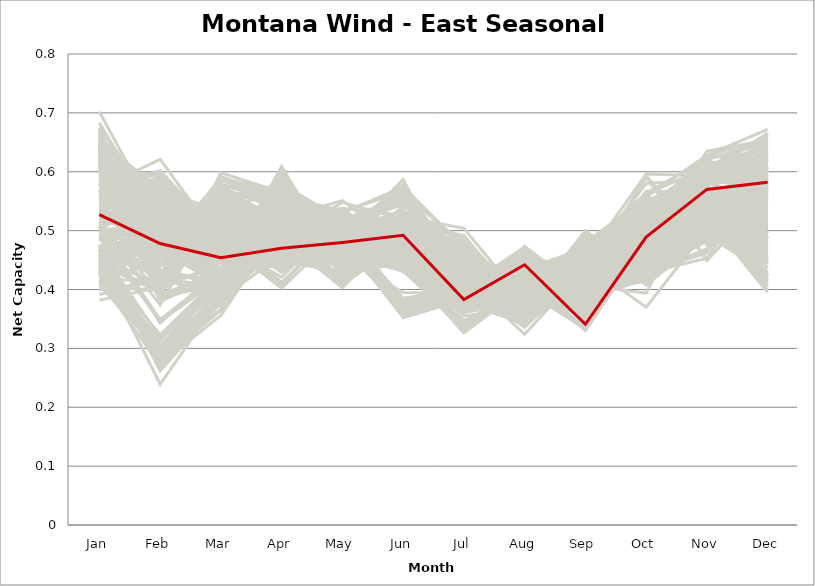
| Category | sample_001 | sample_002 | sample_003 | sample_004 | sample_005 | sample_006 | sample_007 | sample_008 | sample_009 | sample_010 | sample_011 | sample_012 | sample_013 | sample_014 | sample_015 | sample_016 | sample_017 | sample_018 | sample_019 | sample_020 | sample_021 | sample_022 | sample_023 | sample_024 | sample_025 | sample_026 | sample_027 | sample_028 | sample_029 | sample_030 | sample_031 | sample_032 | sample_033 | sample_034 | sample_035 | sample_036 | sample_037 | sample_038 | sample_039 | sample_040 | sample_041 | sample_042 | sample_043 | sample_044 | sample_045 | sample_046 | sample_047 | sample_048 | sample_049 | sample_050 | sample_051 | sample_052 | sample_053 | sample_054 | sample_055 | sample_056 | sample_057 | sample_058 | sample_059 | sample_060 | sample_061 | sample_062 | sample_063 | sample_064 | sample_065 | sample_066 | sample_067 | sample_068 | sample_069 | sample_070 | sample_071 | sample_072 | sample_073 | sample_074 | sample_075 | sample_076 | sample_077 | sample_078 | sample_079 | sample_080 | sample_081 | sample_082 | sample_083 | sample_084 | sample_085 | sample_086 | sample_087 | sample_088 | sample_089 | sample_090 | sample_091 | sample_092 | sample_093 | sample_094 | sample_095 | sample_096 | sample_097 | sample_098 | sample_099 | sample_100 | sample_101 | sample_102 | sample_103 | sample_104 | sample_105 | sample_106 | sample_107 | sample_108 | sample_109 | sample_110 | sample_111 | sample_112 | sample_113 | sample_114 | sample_115 | sample_116 | sample_117 | sample_118 | sample_119 | sample_120 | sample_121 | sample_122 | sample_123 | sample_124 | sample_125 | sample_126 | sample_127 | sample_128 | sample_129 | sample_130 | sample_131 | sample_132 | sample_133 | sample_134 | sample_135 | sample_136 | sample_137 | sample_138 | sample_139 | sample_140 | sample_141 | sample_142 | sample_143 | sample_144 | sample_145 | sample_146 | sample_147 | sample_148 | sample_149 | sample_150 | sample_151 | sample_152 | sample_153 | sample_154 | sample_155 | sample_156 | sample_157 | sample_158 | sample_159 | sample_160 | sample_161 | sample_162 | sample_163 | sample_164 | sample_165 | sample_166 | sample_167 | sample_168 | sample_169 | sample_170 | sample_171 | sample_172 | sample_173 | sample_174 | sample_175 | sample_176 | sample_177 | sample_178 | sample_179 | sample_180 | sample_181 | sample_182 | sample_183 | sample_184 | sample_185 | sample_186 | sample_187 | sample_188 | sample_189 | sample_190 | sample_191 | sample_192 | sample_193 | sample_194 | sample_195 | sample_196 | sample_197 | sample_198 | sample_199 | sample_200 | sample_201 | sample_202 | sample_203 | sample_204 | sample_205 | sample_206 | sample_207 | sample_208 | sample_209 | sample_210 | sample_211 | sample_212 | sample_213 | sample_214 | sample_215 | sample_216 | sample_217 | sample_218 | sample_219 | sample_220 | sample_221 | sample_222 | sample_223 | sample_224 | sample_225 | sample_227 | sample_228 | sample_229 | sample_230 | sample_231 | sample_232 | sample_233 | sample_234 | sample_235 | sample_236 | sample_237 | sample_238 | sample_239 | sample_240 | sample_241 | sample_242 | sample_243 | sample_244 | sample_245 | sample_246 | sample_247 | sample_248 | sample_249 | sample_250 | sample_226 |
|---|---|---|---|---|---|---|---|---|---|---|---|---|---|---|---|---|---|---|---|---|---|---|---|---|---|---|---|---|---|---|---|---|---|---|---|---|---|---|---|---|---|---|---|---|---|---|---|---|---|---|---|---|---|---|---|---|---|---|---|---|---|---|---|---|---|---|---|---|---|---|---|---|---|---|---|---|---|---|---|---|---|---|---|---|---|---|---|---|---|---|---|---|---|---|---|---|---|---|---|---|---|---|---|---|---|---|---|---|---|---|---|---|---|---|---|---|---|---|---|---|---|---|---|---|---|---|---|---|---|---|---|---|---|---|---|---|---|---|---|---|---|---|---|---|---|---|---|---|---|---|---|---|---|---|---|---|---|---|---|---|---|---|---|---|---|---|---|---|---|---|---|---|---|---|---|---|---|---|---|---|---|---|---|---|---|---|---|---|---|---|---|---|---|---|---|---|---|---|---|---|---|---|---|---|---|---|---|---|---|---|---|---|---|---|---|---|---|---|---|---|---|---|---|---|---|---|---|---|---|---|---|---|---|---|---|---|---|---|---|---|---|---|---|---|---|---|---|---|---|---|
| Jan | 0.559 | 0.462 | 0.667 | 0.669 | 0.508 | 0.556 | 0.417 | 0.619 | 0.51 | 0.529 | 0.648 | 0.466 | 0.66 | 0.649 | 0.641 | 0.44 | 0.51 | 0.636 | 0.592 | 0.585 | 0.433 | 0.468 | 0.413 | 0.558 | 0.567 | 0.454 | 0.612 | 0.562 | 0.423 | 0.65 | 0.464 | 0.647 | 0.464 | 0.62 | 0.449 | 0.47 | 0.432 | 0.428 | 0.425 | 0.584 | 0.587 | 0.537 | 0.672 | 0.508 | 0.702 | 0.457 | 0.624 | 0.599 | 0.489 | 0.431 | 0.475 | 0.466 | 0.595 | 0.513 | 0.45 | 0.609 | 0.625 | 0.634 | 0.586 | 0.654 | 0.5 | 0.399 | 0.476 | 0.64 | 0.537 | 0.637 | 0.519 | 0.486 | 0.404 | 0.532 | 0.625 | 0.549 | 0.595 | 0.473 | 0.462 | 0.675 | 0.503 | 0.561 | 0.535 | 0.466 | 0.613 | 0.532 | 0.638 | 0.635 | 0.578 | 0.553 | 0.494 | 0.663 | 0.642 | 0.62 | 0.572 | 0.459 | 0.449 | 0.443 | 0.542 | 0.655 | 0.607 | 0.488 | 0.488 | 0.434 | 0.522 | 0.607 | 0.628 | 0.616 | 0.589 | 0.603 | 0.45 | 0.473 | 0.46 | 0.598 | 0.525 | 0.634 | 0.569 | 0.621 | 0.629 | 0.455 | 0.656 | 0.573 | 0.669 | 0.641 | 0.65 | 0.439 | 0.476 | 0.465 | 0.469 | 0.408 | 0.534 | 0.447 | 0.629 | 0.639 | 0.613 | 0.502 | 0.63 | 0.569 | 0.582 | 0.617 | 0.46 | 0.631 | 0.464 | 0.627 | 0.436 | 0.421 | 0.583 | 0.643 | 0.668 | 0.639 | 0.568 | 0.644 | 0.657 | 0.452 | 0.441 | 0.429 | 0.663 | 0.447 | 0.613 | 0.614 | 0.563 | 0.543 | 0.576 | 0.559 | 0.391 | 0.58 | 0.669 | 0.487 | 0.602 | 0.43 | 0.605 | 0.431 | 0.432 | 0.631 | 0.472 | 0.454 | 0.453 | 0.658 | 0.47 | 0.47 | 0.544 | 0.663 | 0.447 | 0.423 | 0.438 | 0.452 | 0.462 | 0.683 | 0.625 | 0.594 | 0.623 | 0.611 | 0.558 | 0.568 | 0.51 | 0.552 | 0.644 | 0.626 | 0.456 | 0.437 | 0.49 | 0.438 | 0.446 | 0.601 | 0.459 | 0.507 | 0.592 | 0.564 | 0.441 | 0.528 | 0.637 | 0.619 | 0.593 | 0.503 | 0.645 | 0.435 | 0.564 | 0.427 | 0.564 | 0.416 | 0.621 | 0.488 | 0.446 | 0.557 | 0.636 | 0.491 | 0.382 | 0.552 | 0.472 | 0.675 | 0.551 | 0.508 | 0.544 | 0.62 | 0.49 | 0.492 | 0.626 | 0.591 | 0.503 | 0.591 | 0.514 | 0.459 | 0.617 | 0.606 | 0.658 | 0.515 | 0.635 | 0.465 | 0.464 | 0.613 | 0.567 | 0.472 | 0.652 | 0.527 |
| Feb | 0.452 | 0.496 | 0.477 | 0.4 | 0.546 | 0.591 | 0.271 | 0.455 | 0.553 | 0.51 | 0.528 | 0.288 | 0.432 | 0.509 | 0.499 | 0.288 | 0.584 | 0.383 | 0.494 | 0.545 | 0.507 | 0.267 | 0.297 | 0.499 | 0.519 | 0.46 | 0.536 | 0.476 | 0.297 | 0.549 | 0.497 | 0.464 | 0.421 | 0.516 | 0.479 | 0.288 | 0.304 | 0.299 | 0.467 | 0.459 | 0.536 | 0.485 | 0.414 | 0.374 | 0.511 | 0.271 | 0.497 | 0.468 | 0.481 | 0.477 | 0.274 | 0.262 | 0.478 | 0.525 | 0.395 | 0.452 | 0.461 | 0.565 | 0.478 | 0.478 | 0.349 | 0.414 | 0.296 | 0.534 | 0.507 | 0.507 | 0.539 | 0.426 | 0.399 | 0.513 | 0.485 | 0.511 | 0.551 | 0.486 | 0.494 | 0.525 | 0.488 | 0.475 | 0.551 | 0.505 | 0.538 | 0.513 | 0.39 | 0.464 | 0.468 | 0.504 | 0.496 | 0.388 | 0.54 | 0.391 | 0.621 | 0.292 | 0.323 | 0.293 | 0.531 | 0.568 | 0.491 | 0.508 | 0.518 | 0.483 | 0.532 | 0.546 | 0.517 | 0.391 | 0.578 | 0.571 | 0.276 | 0.476 | 0.429 | 0.469 | 0.535 | 0.477 | 0.455 | 0.452 | 0.394 | 0.495 | 0.488 | 0.602 | 0.441 | 0.539 | 0.506 | 0.489 | 0.418 | 0.513 | 0.318 | 0.293 | 0.475 | 0.493 | 0.466 | 0.497 | 0.49 | 0.507 | 0.501 | 0.506 | 0.548 | 0.567 | 0.272 | 0.571 | 0.473 | 0.473 | 0.479 | 0.445 | 0.557 | 0.478 | 0.419 | 0.497 | 0.543 | 0.553 | 0.513 | 0.289 | 0.313 | 0.282 | 0.521 | 0.442 | 0.515 | 0.547 | 0.519 | 0.466 | 0.551 | 0.519 | 0.421 | 0.44 | 0.433 | 0.52 | 0.453 | 0.294 | 0.463 | 0.298 | 0.305 | 0.482 | 0.49 | 0.489 | 0.506 | 0.426 | 0.5 | 0.493 | 0.588 | 0.527 | 0.481 | 0.481 | 0.291 | 0.481 | 0.494 | 0.508 | 0.459 | 0.597 | 0.414 | 0.387 | 0.55 | 0.48 | 0.572 | 0.562 | 0.567 | 0.53 | 0.406 | 0.3 | 0.39 | 0.293 | 0.283 | 0.46 | 0.494 | 0.343 | 0.463 | 0.584 | 0.397 | 0.461 | 0.551 | 0.38 | 0.51 | 0.552 | 0.384 | 0.488 | 0.531 | 0.516 | 0.568 | 0.416 | 0.456 | 0.346 | 0.239 | 0.552 | 0.522 | 0.513 | 0.404 | 0.544 | 0.531 | 0.532 | 0.601 | 0.538 | 0.549 | 0.54 | 0.505 | 0.491 | 0.563 | 0.593 | 0.559 | 0.542 | 0.535 | 0.483 | 0.467 | 0.464 | 0.526 | 0.391 | 0.39 | 0.49 | 0.274 | 0.502 | 0.557 | 0.48 | 0.536 | 0.478 |
| Mar | 0.45 | 0.564 | 0.514 | 0.447 | 0.446 | 0.494 | 0.385 | 0.526 | 0.463 | 0.476 | 0.528 | 0.396 | 0.414 | 0.505 | 0.536 | 0.425 | 0.499 | 0.424 | 0.516 | 0.52 | 0.498 | 0.377 | 0.427 | 0.493 | 0.479 | 0.521 | 0.494 | 0.507 | 0.426 | 0.531 | 0.49 | 0.556 | 0.38 | 0.384 | 0.538 | 0.403 | 0.407 | 0.423 | 0.494 | 0.5 | 0.507 | 0.511 | 0.434 | 0.552 | 0.539 | 0.38 | 0.518 | 0.491 | 0.489 | 0.528 | 0.389 | 0.378 | 0.563 | 0.435 | 0.567 | 0.507 | 0.504 | 0.525 | 0.496 | 0.551 | 0.429 | 0.549 | 0.388 | 0.529 | 0.452 | 0.404 | 0.485 | 0.549 | 0.573 | 0.447 | 0.412 | 0.455 | 0.514 | 0.519 | 0.535 | 0.534 | 0.496 | 0.491 | 0.474 | 0.473 | 0.512 | 0.47 | 0.433 | 0.506 | 0.585 | 0.5 | 0.491 | 0.431 | 0.398 | 0.577 | 0.479 | 0.39 | 0.423 | 0.388 | 0.463 | 0.533 | 0.502 | 0.509 | 0.435 | 0.522 | 0.473 | 0.464 | 0.522 | 0.598 | 0.499 | 0.483 | 0.365 | 0.546 | 0.372 | 0.511 | 0.471 | 0.514 | 0.498 | 0.502 | 0.415 | 0.512 | 0.557 | 0.49 | 0.573 | 0.387 | 0.514 | 0.53 | 0.559 | 0.55 | 0.403 | 0.42 | 0.486 | 0.519 | 0.407 | 0.417 | 0.528 | 0.499 | 0.479 | 0.479 | 0.508 | 0.474 | 0.387 | 0.45 | 0.473 | 0.412 | 0.536 | 0.487 | 0.491 | 0.532 | 0.404 | 0.445 | 0.497 | 0.391 | 0.524 | 0.365 | 0.427 | 0.392 | 0.511 | 0.518 | 0.498 | 0.483 | 0.457 | 0.506 | 0.491 | 0.524 | 0.552 | 0.498 | 0.406 | 0.427 | 0.578 | 0.43 | 0.589 | 0.422 | 0.417 | 0.525 | 0.487 | 0.514 | 0.509 | 0.585 | 0.49 | 0.485 | 0.479 | 0.513 | 0.519 | 0.522 | 0.388 | 0.508 | 0.543 | 0.395 | 0.482 | 0.471 | 0.589 | 0.409 | 0.494 | 0.579 | 0.483 | 0.492 | 0.518 | 0.418 | 0.569 | 0.393 | 0.57 | 0.415 | 0.366 | 0.458 | 0.49 | 0.437 | 0.589 | 0.497 | 0.54 | 0.478 | 0.406 | 0.425 | 0.486 | 0.444 | 0.42 | 0.527 | 0.458 | 0.49 | 0.498 | 0.496 | 0.543 | 0.42 | 0.388 | 0.46 | 0.519 | 0.421 | 0.554 | 0.487 | 0.423 | 0.39 | 0.478 | 0.456 | 0.455 | 0.491 | 0.475 | 0.504 | 0.523 | 0.491 | 0.49 | 0.525 | 0.455 | 0.489 | 0.511 | 0.504 | 0.39 | 0.544 | 0.592 | 0.473 | 0.356 | 0.494 | 0.526 | 0.563 | 0.536 | 0.454 |
| Apr | 0.526 | 0.471 | 0.534 | 0.506 | 0.475 | 0.48 | 0.514 | 0.469 | 0.454 | 0.498 | 0.516 | 0.546 | 0.49 | 0.516 | 0.44 | 0.608 | 0.412 | 0.532 | 0.436 | 0.5 | 0.462 | 0.524 | 0.594 | 0.45 | 0.454 | 0.527 | 0.473 | 0.446 | 0.592 | 0.515 | 0.475 | 0.579 | 0.488 | 0.459 | 0.459 | 0.545 | 0.6 | 0.601 | 0.549 | 0.513 | 0.473 | 0.43 | 0.49 | 0.527 | 0.53 | 0.513 | 0.444 | 0.483 | 0.447 | 0.446 | 0.523 | 0.528 | 0.554 | 0.474 | 0.504 | 0.506 | 0.496 | 0.523 | 0.442 | 0.563 | 0.523 | 0.534 | 0.568 | 0.522 | 0.496 | 0.471 | 0.474 | 0.521 | 0.535 | 0.483 | 0.466 | 0.463 | 0.474 | 0.451 | 0.445 | 0.51 | 0.463 | 0.43 | 0.445 | 0.47 | 0.443 | 0.444 | 0.517 | 0.456 | 0.555 | 0.438 | 0.497 | 0.511 | 0.463 | 0.555 | 0.518 | 0.533 | 0.588 | 0.577 | 0.471 | 0.536 | 0.436 | 0.442 | 0.457 | 0.448 | 0.486 | 0.535 | 0.524 | 0.565 | 0.484 | 0.483 | 0.514 | 0.458 | 0.511 | 0.491 | 0.494 | 0.447 | 0.48 | 0.468 | 0.506 | 0.454 | 0.559 | 0.474 | 0.573 | 0.476 | 0.514 | 0.448 | 0.521 | 0.474 | 0.584 | 0.601 | 0.448 | 0.461 | 0.458 | 0.476 | 0.443 | 0.494 | 0.536 | 0.443 | 0.464 | 0.521 | 0.531 | 0.533 | 0.483 | 0.469 | 0.449 | 0.551 | 0.471 | 0.467 | 0.503 | 0.526 | 0.476 | 0.476 | 0.535 | 0.538 | 0.596 | 0.527 | 0.55 | 0.536 | 0.448 | 0.539 | 0.522 | 0.429 | 0.485 | 0.464 | 0.528 | 0.538 | 0.487 | 0.463 | 0.556 | 0.597 | 0.558 | 0.602 | 0.604 | 0.443 | 0.448 | 0.448 | 0.468 | 0.556 | 0.478 | 0.448 | 0.48 | 0.525 | 0.459 | 0.458 | 0.582 | 0.454 | 0.457 | 0.482 | 0.542 | 0.508 | 0.566 | 0.497 | 0.475 | 0.545 | 0.402 | 0.432 | 0.506 | 0.557 | 0.52 | 0.582 | 0.512 | 0.609 | 0.544 | 0.534 | 0.454 | 0.522 | 0.549 | 0.483 | 0.517 | 0.421 | 0.475 | 0.516 | 0.444 | 0.438 | 0.498 | 0.455 | 0.481 | 0.459 | 0.477 | 0.552 | 0.56 | 0.527 | 0.531 | 0.494 | 0.525 | 0.459 | 0.523 | 0.472 | 0.46 | 0.468 | 0.49 | 0.477 | 0.477 | 0.521 | 0.5 | 0.484 | 0.519 | 0.497 | 0.407 | 0.475 | 0.472 | 0.474 | 0.472 | 0.466 | 0.476 | 0.519 | 0.552 | 0.441 | 0.51 | 0.44 | 0.478 | 0.46 | 0.52 | 0.47 |
| May | 0.494 | 0.515 | 0.462 | 0.478 | 0.496 | 0.528 | 0.535 | 0.483 | 0.512 | 0.408 | 0.494 | 0.519 | 0.51 | 0.476 | 0.502 | 0.435 | 0.512 | 0.468 | 0.498 | 0.492 | 0.488 | 0.535 | 0.462 | 0.503 | 0.495 | 0.492 | 0.491 | 0.518 | 0.46 | 0.471 | 0.494 | 0.518 | 0.548 | 0.501 | 0.526 | 0.514 | 0.451 | 0.453 | 0.476 | 0.431 | 0.502 | 0.522 | 0.498 | 0.467 | 0.469 | 0.535 | 0.505 | 0.437 | 0.431 | 0.533 | 0.537 | 0.537 | 0.501 | 0.496 | 0.48 | 0.437 | 0.442 | 0.482 | 0.511 | 0.53 | 0.529 | 0.444 | 0.496 | 0.477 | 0.496 | 0.502 | 0.416 | 0.477 | 0.451 | 0.491 | 0.495 | 0.497 | 0.501 | 0.441 | 0.529 | 0.484 | 0.418 | 0.53 | 0.518 | 0.494 | 0.495 | 0.525 | 0.482 | 0.476 | 0.501 | 0.518 | 0.409 | 0.491 | 0.517 | 0.501 | 0.456 | 0.523 | 0.456 | 0.466 | 0.482 | 0.484 | 0.498 | 0.448 | 0.5 | 0.536 | 0.403 | 0.486 | 0.476 | 0.513 | 0.481 | 0.477 | 0.521 | 0.527 | 0.538 | 0.436 | 0.494 | 0.491 | 0.449 | 0.458 | 0.483 | 0.498 | 0.533 | 0.473 | 0.511 | 0.5 | 0.475 | 0.533 | 0.474 | 0.507 | 0.473 | 0.437 | 0.504 | 0.53 | 0.504 | 0.5 | 0.497 | 0.416 | 0.505 | 0.496 | 0.488 | 0.5 | 0.522 | 0.489 | 0.498 | 0.516 | 0.528 | 0.476 | 0.514 | 0.476 | 0.504 | 0.428 | 0.512 | 0.503 | 0.479 | 0.516 | 0.443 | 0.523 | 0.462 | 0.483 | 0.495 | 0.498 | 0.455 | 0.517 | 0.499 | 0.512 | 0.44 | 0.43 | 0.506 | 0.499 | 0.494 | 0.446 | 0.498 | 0.445 | 0.451 | 0.49 | 0.432 | 0.536 | 0.496 | 0.494 | 0.482 | 0.458 | 0.513 | 0.461 | 0.52 | 0.526 | 0.471 | 0.512 | 0.527 | 0.497 | 0.429 | 0.464 | 0.488 | 0.485 | 0.505 | 0.503 | 0.503 | 0.508 | 0.48 | 0.514 | 0.468 | 0.472 | 0.466 | 0.434 | 0.51 | 0.409 | 0.509 | 0.551 | 0.497 | 0.518 | 0.465 | 0.524 | 0.501 | 0.491 | 0.501 | 0.516 | 0.49 | 0.527 | 0.472 | 0.483 | 0.508 | 0.491 | 0.517 | 0.518 | 0.516 | 0.484 | 0.485 | 0.492 | 0.448 | 0.507 | 0.5 | 0.496 | 0.498 | 0.489 | 0.484 | 0.498 | 0.42 | 0.425 | 0.478 | 0.458 | 0.521 | 0.506 | 0.487 | 0.493 | 0.476 | 0.46 | 0.499 | 0.472 | 0.504 | 0.47 | 0.522 | 0.497 | 0.515 | 0.523 | 0.485 | 0.48 |
| Jun | 0.491 | 0.449 | 0.483 | 0.366 | 0.484 | 0.459 | 0.442 | 0.463 | 0.502 | 0.509 | 0.507 | 0.452 | 0.366 | 0.479 | 0.467 | 0.449 | 0.521 | 0.37 | 0.46 | 0.491 | 0.515 | 0.454 | 0.431 | 0.457 | 0.45 | 0.463 | 0.5 | 0.485 | 0.435 | 0.499 | 0.563 | 0.558 | 0.519 | 0.358 | 0.46 | 0.444 | 0.45 | 0.434 | 0.479 | 0.47 | 0.503 | 0.498 | 0.376 | 0.465 | 0.488 | 0.449 | 0.466 | 0.474 | 0.468 | 0.475 | 0.46 | 0.445 | 0.555 | 0.485 | 0.487 | 0.498 | 0.487 | 0.531 | 0.482 | 0.574 | 0.497 | 0.468 | 0.43 | 0.534 | 0.495 | 0.383 | 0.515 | 0.48 | 0.484 | 0.49 | 0.365 | 0.497 | 0.498 | 0.469 | 0.477 | 0.496 | 0.486 | 0.501 | 0.491 | 0.569 | 0.454 | 0.483 | 0.374 | 0.462 | 0.568 | 0.479 | 0.479 | 0.364 | 0.377 | 0.548 | 0.524 | 0.45 | 0.453 | 0.436 | 0.494 | 0.527 | 0.443 | 0.463 | 0.5 | 0.464 | 0.51 | 0.494 | 0.477 | 0.554 | 0.533 | 0.509 | 0.479 | 0.451 | 0.526 | 0.49 | 0.515 | 0.457 | 0.477 | 0.466 | 0.366 | 0.524 | 0.566 | 0.516 | 0.544 | 0.374 | 0.491 | 0.474 | 0.465 | 0.451 | 0.447 | 0.445 | 0.493 | 0.475 | 0.352 | 0.385 | 0.468 | 0.475 | 0.488 | 0.44 | 0.509 | 0.484 | 0.441 | 0.481 | 0.573 | 0.367 | 0.463 | 0.478 | 0.505 | 0.477 | 0.353 | 0.513 | 0.496 | 0.38 | 0.487 | 0.498 | 0.445 | 0.447 | 0.48 | 0.466 | 0.457 | 0.49 | 0.395 | 0.49 | 0.489 | 0.469 | 0.49 | 0.483 | 0.353 | 0.474 | 0.564 | 0.436 | 0.576 | 0.442 | 0.451 | 0.457 | 0.481 | 0.46 | 0.535 | 0.579 | 0.587 | 0.441 | 0.479 | 0.49 | 0.503 | 0.471 | 0.434 | 0.527 | 0.46 | 0.376 | 0.514 | 0.522 | 0.559 | 0.353 | 0.491 | 0.562 | 0.521 | 0.512 | 0.512 | 0.488 | 0.477 | 0.444 | 0.471 | 0.441 | 0.491 | 0.478 | 0.527 | 0.471 | 0.577 | 0.465 | 0.471 | 0.488 | 0.381 | 0.367 | 0.457 | 0.485 | 0.359 | 0.444 | 0.535 | 0.514 | 0.493 | 0.472 | 0.546 | 0.509 | 0.454 | 0.511 | 0.484 | 0.5 | 0.478 | 0.494 | 0.477 | 0.365 | 0.484 | 0.48 | 0.529 | 0.49 | 0.476 | 0.478 | 0.525 | 0.541 | 0.513 | 0.516 | 0.489 | 0.551 | 0.455 | 0.473 | 0.359 | 0.471 | 0.552 | 0.443 | 0.473 | 0.435 | 0.523 | 0.46 | 0.505 | 0.492 |
| Jul | 0.398 | 0.453 | 0.403 | 0.406 | 0.396 | 0.466 | 0.371 | 0.385 | 0.419 | 0.403 | 0.399 | 0.368 | 0.385 | 0.386 | 0.407 | 0.345 | 0.42 | 0.407 | 0.39 | 0.395 | 0.401 | 0.388 | 0.338 | 0.416 | 0.421 | 0.458 | 0.469 | 0.412 | 0.341 | 0.402 | 0.392 | 0.448 | 0.365 | 0.401 | 0.421 | 0.375 | 0.355 | 0.336 | 0.463 | 0.377 | 0.478 | 0.392 | 0.393 | 0.445 | 0.419 | 0.385 | 0.403 | 0.376 | 0.403 | 0.401 | 0.402 | 0.383 | 0.423 | 0.408 | 0.44 | 0.385 | 0.39 | 0.403 | 0.407 | 0.472 | 0.372 | 0.434 | 0.375 | 0.39 | 0.397 | 0.408 | 0.411 | 0.451 | 0.436 | 0.413 | 0.384 | 0.399 | 0.473 | 0.426 | 0.402 | 0.412 | 0.404 | 0.4 | 0.418 | 0.396 | 0.434 | 0.393 | 0.41 | 0.379 | 0.434 | 0.418 | 0.406 | 0.402 | 0.413 | 0.439 | 0.504 | 0.368 | 0.361 | 0.362 | 0.414 | 0.41 | 0.421 | 0.43 | 0.375 | 0.409 | 0.399 | 0.432 | 0.398 | 0.459 | 0.488 | 0.492 | 0.374 | 0.426 | 0.374 | 0.39 | 0.417 | 0.397 | 0.381 | 0.381 | 0.397 | 0.4 | 0.473 | 0.487 | 0.45 | 0.408 | 0.409 | 0.403 | 0.455 | 0.452 | 0.382 | 0.347 | 0.397 | 0.397 | 0.383 | 0.4 | 0.405 | 0.4 | 0.413 | 0.421 | 0.473 | 0.42 | 0.379 | 0.429 | 0.371 | 0.398 | 0.427 | 0.466 | 0.475 | 0.4 | 0.39 | 0.45 | 0.477 | 0.402 | 0.397 | 0.375 | 0.334 | 0.366 | 0.401 | 0.458 | 0.436 | 0.44 | 0.394 | 0.385 | 0.477 | 0.437 | 0.436 | 0.381 | 0.394 | 0.398 | 0.426 | 0.331 | 0.43 | 0.326 | 0.338 | 0.422 | 0.413 | 0.398 | 0.4 | 0.421 | 0.392 | 0.415 | 0.47 | 0.401 | 0.402 | 0.386 | 0.366 | 0.396 | 0.423 | 0.409 | 0.423 | 0.489 | 0.428 | 0.39 | 0.475 | 0.421 | 0.426 | 0.42 | 0.391 | 0.423 | 0.449 | 0.366 | 0.449 | 0.344 | 0.373 | 0.446 | 0.391 | 0.385 | 0.427 | 0.461 | 0.436 | 0.383 | 0.412 | 0.402 | 0.434 | 0.405 | 0.393 | 0.413 | 0.419 | 0.397 | 0.486 | 0.463 | 0.442 | 0.367 | 0.379 | 0.41 | 0.393 | 0.378 | 0.426 | 0.474 | 0.397 | 0.422 | 0.474 | 0.409 | 0.414 | 0.455 | 0.404 | 0.406 | 0.398 | 0.481 | 0.427 | 0.478 | 0.405 | 0.395 | 0.379 | 0.378 | 0.4 | 0.442 | 0.452 | 0.423 | 0.373 | 0.421 | 0.486 | 0.435 | 0.418 | 0.383 |
| Aug | 0.405 | 0.424 | 0.342 | 0.405 | 0.437 | 0.413 | 0.368 | 0.424 | 0.379 | 0.424 | 0.337 | 0.362 | 0.43 | 0.361 | 0.404 | 0.38 | 0.368 | 0.404 | 0.42 | 0.351 | 0.468 | 0.343 | 0.416 | 0.424 | 0.415 | 0.354 | 0.376 | 0.403 | 0.41 | 0.347 | 0.444 | 0.377 | 0.391 | 0.444 | 0.424 | 0.354 | 0.37 | 0.41 | 0.348 | 0.439 | 0.375 | 0.421 | 0.407 | 0.361 | 0.338 | 0.352 | 0.405 | 0.432 | 0.414 | 0.458 | 0.337 | 0.35 | 0.399 | 0.427 | 0.367 | 0.43 | 0.416 | 0.34 | 0.405 | 0.377 | 0.365 | 0.378 | 0.363 | 0.347 | 0.359 | 0.424 | 0.393 | 0.374 | 0.368 | 0.423 | 0.455 | 0.343 | 0.381 | 0.394 | 0.449 | 0.342 | 0.43 | 0.425 | 0.377 | 0.443 | 0.398 | 0.385 | 0.406 | 0.417 | 0.412 | 0.411 | 0.418 | 0.407 | 0.426 | 0.389 | 0.378 | 0.361 | 0.38 | 0.377 | 0.429 | 0.356 | 0.397 | 0.403 | 0.436 | 0.458 | 0.407 | 0.406 | 0.35 | 0.378 | 0.373 | 0.367 | 0.352 | 0.435 | 0.369 | 0.42 | 0.346 | 0.403 | 0.439 | 0.424 | 0.429 | 0.468 | 0.381 | 0.378 | 0.382 | 0.421 | 0.341 | 0.472 | 0.363 | 0.427 | 0.364 | 0.396 | 0.439 | 0.465 | 0.451 | 0.415 | 0.406 | 0.422 | 0.424 | 0.406 | 0.39 | 0.417 | 0.345 | 0.448 | 0.447 | 0.393 | 0.43 | 0.351 | 0.385 | 0.408 | 0.429 | 0.405 | 0.376 | 0.414 | 0.362 | 0.346 | 0.394 | 0.38 | 0.354 | 0.346 | 0.398 | 0.407 | 0.386 | 0.434 | 0.388 | 0.424 | 0.367 | 0.433 | 0.432 | 0.441 | 0.402 | 0.42 | 0.398 | 0.404 | 0.401 | 0.394 | 0.406 | 0.456 | 0.453 | 0.417 | 0.453 | 0.404 | 0.396 | 0.358 | 0.456 | 0.473 | 0.371 | 0.459 | 0.432 | 0.405 | 0.39 | 0.373 | 0.406 | 0.434 | 0.392 | 0.405 | 0.37 | 0.364 | 0.351 | 0.449 | 0.362 | 0.374 | 0.377 | 0.383 | 0.347 | 0.365 | 0.456 | 0.358 | 0.411 | 0.414 | 0.369 | 0.44 | 0.42 | 0.425 | 0.413 | 0.383 | 0.418 | 0.454 | 0.324 | 0.461 | 0.379 | 0.338 | 0.377 | 0.362 | 0.341 | 0.345 | 0.351 | 0.432 | 0.378 | 0.395 | 0.443 | 0.413 | 0.391 | 0.423 | 0.336 | 0.367 | 0.42 | 0.413 | 0.375 | 0.367 | 0.37 | 0.371 | 0.426 | 0.457 | 0.412 | 0.43 | 0.43 | 0.369 | 0.397 | 0.373 | 0.347 | 0.404 | 0.377 | 0.419 | 0.338 | 0.442 |
| Sep | 0.444 | 0.377 | 0.469 | 0.462 | 0.351 | 0.375 | 0.5 | 0.452 | 0.411 | 0.465 | 0.462 | 0.486 | 0.457 | 0.47 | 0.444 | 0.47 | 0.406 | 0.48 | 0.449 | 0.456 | 0.384 | 0.492 | 0.455 | 0.406 | 0.422 | 0.419 | 0.411 | 0.38 | 0.454 | 0.46 | 0.393 | 0.389 | 0.417 | 0.408 | 0.395 | 0.478 | 0.473 | 0.458 | 0.436 | 0.446 | 0.408 | 0.371 | 0.472 | 0.475 | 0.471 | 0.491 | 0.439 | 0.471 | 0.448 | 0.388 | 0.486 | 0.489 | 0.333 | 0.352 | 0.447 | 0.447 | 0.459 | 0.435 | 0.38 | 0.392 | 0.422 | 0.426 | 0.484 | 0.431 | 0.457 | 0.387 | 0.449 | 0.459 | 0.429 | 0.355 | 0.434 | 0.483 | 0.412 | 0.428 | 0.393 | 0.453 | 0.428 | 0.356 | 0.427 | 0.39 | 0.418 | 0.417 | 0.466 | 0.459 | 0.336 | 0.384 | 0.462 | 0.466 | 0.396 | 0.372 | 0.402 | 0.484 | 0.459 | 0.474 | 0.33 | 0.417 | 0.43 | 0.425 | 0.369 | 0.393 | 0.462 | 0.4 | 0.464 | 0.368 | 0.405 | 0.409 | 0.478 | 0.396 | 0.425 | 0.445 | 0.436 | 0.456 | 0.437 | 0.464 | 0.468 | 0.385 | 0.396 | 0.414 | 0.359 | 0.405 | 0.469 | 0.379 | 0.451 | 0.367 | 0.462 | 0.47 | 0.349 | 0.395 | 0.43 | 0.426 | 0.441 | 0.461 | 0.407 | 0.414 | 0.413 | 0.427 | 0.499 | 0.393 | 0.412 | 0.434 | 0.392 | 0.422 | 0.413 | 0.437 | 0.459 | 0.397 | 0.406 | 0.398 | 0.457 | 0.49 | 0.473 | 0.481 | 0.459 | 0.416 | 0.421 | 0.394 | 0.477 | 0.382 | 0.409 | 0.377 | 0.446 | 0.456 | 0.455 | 0.354 | 0.355 | 0.456 | 0.355 | 0.477 | 0.466 | 0.43 | 0.445 | 0.385 | 0.381 | 0.336 | 0.409 | 0.433 | 0.396 | 0.457 | 0.375 | 0.394 | 0.484 | 0.385 | 0.391 | 0.393 | 0.447 | 0.423 | 0.349 | 0.47 | 0.417 | 0.332 | 0.385 | 0.398 | 0.444 | 0.398 | 0.431 | 0.477 | 0.449 | 0.473 | 0.486 | 0.45 | 0.38 | 0.408 | 0.354 | 0.371 | 0.479 | 0.366 | 0.398 | 0.466 | 0.404 | 0.426 | 0.467 | 0.394 | 0.436 | 0.389 | 0.408 | 0.425 | 0.403 | 0.406 | 0.494 | 0.434 | 0.469 | 0.368 | 0.425 | 0.41 | 0.342 | 0.391 | 0.399 | 0.36 | 0.439 | 0.415 | 0.462 | 0.446 | 0.407 | 0.408 | 0.395 | 0.411 | 0.35 | 0.377 | 0.453 | 0.459 | 0.396 | 0.458 | 0.36 | 0.435 | 0.496 | 0.427 | 0.412 | 0.386 | 0.46 | 0.341 |
| Oct | 0.37 | 0.507 | 0.542 | 0.554 | 0.493 | 0.5 | 0.409 | 0.51 | 0.442 | 0.46 | 0.512 | 0.426 | 0.545 | 0.564 | 0.515 | 0.457 | 0.504 | 0.555 | 0.491 | 0.487 | 0.429 | 0.431 | 0.446 | 0.499 | 0.515 | 0.487 | 0.461 | 0.458 | 0.457 | 0.525 | 0.436 | 0.488 | 0.523 | 0.541 | 0.479 | 0.434 | 0.444 | 0.468 | 0.501 | 0.545 | 0.452 | 0.464 | 0.552 | 0.477 | 0.54 | 0.428 | 0.518 | 0.52 | 0.502 | 0.457 | 0.432 | 0.432 | 0.503 | 0.482 | 0.464 | 0.535 | 0.53 | 0.482 | 0.467 | 0.465 | 0.591 | 0.477 | 0.437 | 0.481 | 0.508 | 0.516 | 0.463 | 0.46 | 0.48 | 0.492 | 0.537 | 0.534 | 0.447 | 0.528 | 0.452 | 0.522 | 0.502 | 0.473 | 0.457 | 0.43 | 0.515 | 0.466 | 0.53 | 0.51 | 0.486 | 0.478 | 0.509 | 0.545 | 0.547 | 0.478 | 0.461 | 0.43 | 0.465 | 0.431 | 0.482 | 0.473 | 0.514 | 0.527 | 0.504 | 0.44 | 0.461 | 0.414 | 0.504 | 0.465 | 0.464 | 0.452 | 0.408 | 0.479 | 0.528 | 0.558 | 0.489 | 0.51 | 0.529 | 0.502 | 0.529 | 0.417 | 0.483 | 0.449 | 0.505 | 0.516 | 0.522 | 0.446 | 0.467 | 0.497 | 0.442 | 0.436 | 0.482 | 0.442 | 0.535 | 0.54 | 0.509 | 0.512 | 0.394 | 0.531 | 0.448 | 0.417 | 0.432 | 0.443 | 0.429 | 0.551 | 0.462 | 0.489 | 0.457 | 0.511 | 0.529 | 0.552 | 0.492 | 0.548 | 0.557 | 0.413 | 0.454 | 0.416 | 0.529 | 0.503 | 0.525 | 0.418 | 0.414 | 0.457 | 0.473 | 0.504 | 0.464 | 0.535 | 0.534 | 0.473 | 0.492 | 0.447 | 0.486 | 0.437 | 0.44 | 0.53 | 0.529 | 0.434 | 0.434 | 0.5 | 0.42 | 0.54 | 0.479 | 0.532 | 0.447 | 0.435 | 0.432 | 0.433 | 0.47 | 0.54 | 0.58 | 0.445 | 0.493 | 0.515 | 0.46 | 0.518 | 0.52 | 0.517 | 0.485 | 0.418 | 0.486 | 0.422 | 0.468 | 0.449 | 0.408 | 0.596 | 0.428 | 0.593 | 0.471 | 0.486 | 0.44 | 0.47 | 0.542 | 0.521 | 0.517 | 0.442 | 0.539 | 0.461 | 0.53 | 0.427 | 0.469 | 0.504 | 0.472 | 0.592 | 0.441 | 0.507 | 0.562 | 0.482 | 0.462 | 0.452 | 0.476 | 0.527 | 0.485 | 0.489 | 0.498 | 0.413 | 0.484 | 0.504 | 0.468 | 0.46 | 0.497 | 0.453 | 0.497 | 0.426 | 0.516 | 0.499 | 0.542 | 0.473 | 0.485 | 0.567 | 0.409 | 0.514 | 0.446 | 0.475 | 0.528 | 0.489 |
| Nov | 0.502 | 0.507 | 0.614 | 0.545 | 0.606 | 0.589 | 0.492 | 0.519 | 0.525 | 0.541 | 0.595 | 0.528 | 0.523 | 0.621 | 0.544 | 0.513 | 0.528 | 0.494 | 0.537 | 0.588 | 0.486 | 0.493 | 0.499 | 0.515 | 0.502 | 0.554 | 0.579 | 0.54 | 0.498 | 0.607 | 0.465 | 0.499 | 0.499 | 0.528 | 0.509 | 0.537 | 0.527 | 0.495 | 0.545 | 0.523 | 0.607 | 0.539 | 0.531 | 0.509 | 0.615 | 0.491 | 0.549 | 0.512 | 0.556 | 0.491 | 0.504 | 0.508 | 0.55 | 0.593 | 0.529 | 0.526 | 0.515 | 0.628 | 0.522 | 0.486 | 0.449 | 0.543 | 0.528 | 0.61 | 0.521 | 0.526 | 0.551 | 0.505 | 0.555 | 0.605 | 0.529 | 0.49 | 0.604 | 0.571 | 0.498 | 0.609 | 0.554 | 0.557 | 0.522 | 0.462 | 0.539 | 0.507 | 0.533 | 0.512 | 0.535 | 0.525 | 0.532 | 0.524 | 0.543 | 0.498 | 0.57 | 0.521 | 0.529 | 0.535 | 0.597 | 0.635 | 0.532 | 0.566 | 0.599 | 0.501 | 0.533 | 0.602 | 0.61 | 0.49 | 0.581 | 0.591 | 0.497 | 0.508 | 0.491 | 0.517 | 0.544 | 0.549 | 0.514 | 0.511 | 0.514 | 0.497 | 0.499 | 0.589 | 0.495 | 0.544 | 0.596 | 0.506 | 0.51 | 0.512 | 0.546 | 0.516 | 0.564 | 0.488 | 0.53 | 0.547 | 0.537 | 0.534 | 0.595 | 0.495 | 0.589 | 0.617 | 0.505 | 0.568 | 0.453 | 0.53 | 0.511 | 0.544 | 0.601 | 0.529 | 0.533 | 0.586 | 0.576 | 0.531 | 0.628 | 0.492 | 0.518 | 0.516 | 0.627 | 0.555 | 0.538 | 0.61 | 0.531 | 0.538 | 0.59 | 0.598 | 0.539 | 0.521 | 0.538 | 0.589 | 0.538 | 0.493 | 0.54 | 0.505 | 0.5 | 0.564 | 0.557 | 0.502 | 0.485 | 0.514 | 0.488 | 0.576 | 0.576 | 0.61 | 0.483 | 0.485 | 0.53 | 0.496 | 0.519 | 0.543 | 0.587 | 0.582 | 0.517 | 0.512 | 0.593 | 0.54 | 0.543 | 0.555 | 0.621 | 0.54 | 0.543 | 0.539 | 0.514 | 0.517 | 0.49 | 0.593 | 0.494 | 0.476 | 0.529 | 0.604 | 0.485 | 0.551 | 0.533 | 0.513 | 0.529 | 0.515 | 0.526 | 0.512 | 0.54 | 0.482 | 0.59 | 0.548 | 0.506 | 0.451 | 0.493 | 0.557 | 0.608 | 0.598 | 0.554 | 0.588 | 0.589 | 0.543 | 0.577 | 0.591 | 0.547 | 0.619 | 0.527 | 0.555 | 0.628 | 0.569 | 0.541 | 0.6 | 0.61 | 0.469 | 0.514 | 0.51 | 0.538 | 0.509 | 0.492 | 0.566 | 0.496 | 0.544 | 0.587 | 0.528 | 0.607 | 0.57 |
| Dec | 0.446 | 0.517 | 0.594 | 0.423 | 0.593 | 0.644 | 0.465 | 0.575 | 0.596 | 0.565 | 0.612 | 0.46 | 0.395 | 0.648 | 0.522 | 0.469 | 0.54 | 0.431 | 0.529 | 0.636 | 0.603 | 0.456 | 0.537 | 0.576 | 0.589 | 0.55 | 0.602 | 0.618 | 0.529 | 0.619 | 0.609 | 0.493 | 0.55 | 0.453 | 0.509 | 0.465 | 0.451 | 0.516 | 0.517 | 0.574 | 0.613 | 0.621 | 0.408 | 0.619 | 0.611 | 0.473 | 0.519 | 0.55 | 0.532 | 0.565 | 0.464 | 0.47 | 0.496 | 0.577 | 0.565 | 0.563 | 0.541 | 0.655 | 0.6 | 0.488 | 0.56 | 0.561 | 0.444 | 0.644 | 0.544 | 0.493 | 0.591 | 0.637 | 0.563 | 0.589 | 0.437 | 0.569 | 0.617 | 0.51 | 0.57 | 0.591 | 0.527 | 0.6 | 0.59 | 0.606 | 0.545 | 0.602 | 0.404 | 0.58 | 0.493 | 0.597 | 0.542 | 0.416 | 0.445 | 0.51 | 0.565 | 0.454 | 0.463 | 0.443 | 0.59 | 0.654 | 0.528 | 0.496 | 0.593 | 0.569 | 0.579 | 0.628 | 0.62 | 0.517 | 0.596 | 0.602 | 0.461 | 0.506 | 0.579 | 0.542 | 0.576 | 0.516 | 0.571 | 0.533 | 0.422 | 0.585 | 0.492 | 0.597 | 0.504 | 0.48 | 0.589 | 0.544 | 0.632 | 0.52 | 0.447 | 0.474 | 0.597 | 0.592 | 0.424 | 0.458 | 0.513 | 0.533 | 0.591 | 0.584 | 0.614 | 0.561 | 0.458 | 0.575 | 0.602 | 0.428 | 0.523 | 0.514 | 0.646 | 0.568 | 0.398 | 0.536 | 0.635 | 0.484 | 0.623 | 0.462 | 0.525 | 0.472 | 0.619 | 0.548 | 0.55 | 0.612 | 0.47 | 0.609 | 0.649 | 0.666 | 0.573 | 0.564 | 0.412 | 0.611 | 0.479 | 0.525 | 0.488 | 0.511 | 0.49 | 0.526 | 0.504 | 0.571 | 0.584 | 0.505 | 0.594 | 0.486 | 0.65 | 0.61 | 0.586 | 0.574 | 0.422 | 0.553 | 0.533 | 0.472 | 0.495 | 0.58 | 0.486 | 0.417 | 0.629 | 0.485 | 0.502 | 0.535 | 0.652 | 0.558 | 0.563 | 0.447 | 0.592 | 0.482 | 0.462 | 0.487 | 0.572 | 0.584 | 0.492 | 0.64 | 0.664 | 0.62 | 0.465 | 0.437 | 0.546 | 0.607 | 0.412 | 0.521 | 0.557 | 0.608 | 0.652 | 0.521 | 0.503 | 0.556 | 0.426 | 0.569 | 0.659 | 0.593 | 0.582 | 0.634 | 0.615 | 0.494 | 0.651 | 0.588 | 0.572 | 0.591 | 0.545 | 0.535 | 0.672 | 0.583 | 0.534 | 0.625 | 0.596 | 0.601 | 0.555 | 0.55 | 0.477 | 0.627 | 0.506 | 0.488 | 0.471 | 0.542 | 0.635 | 0.514 | 0.602 | 0.582 |